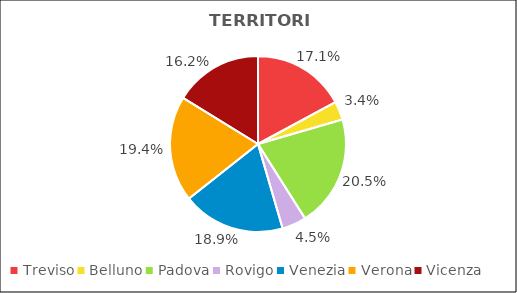
| Category | Series 0 |
|---|---|
| Treviso | 56336 |
| Belluno | 11103 |
| Padova | 67533 |
| Rovigo | 14664 |
| Venezia | 62083 |
| Verona | 63920 |
| Vicenza | 53371 |